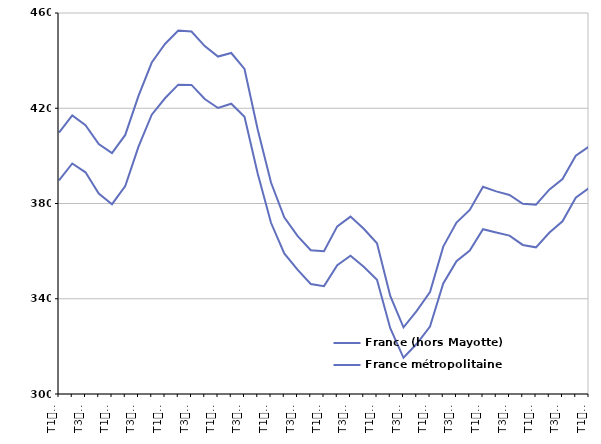
| Category | France (hors Mayotte) | France métropolitaine |
|---|---|---|
| T1
2014 | 409.8 | 389.7 |
| T2
2014 | 417 | 396.8 |
| T3
2014 | 412.9 | 393.1 |
| T4
2014 | 405 | 384.2 |
| T1
2015 | 401.2 | 379.7 |
| T2
2015 | 408.8 | 387.3 |
| T3
2015 | 425.2 | 403.9 |
| T4
2015 | 439.2 | 417.3 |
| T1
2016 | 447 | 424.2 |
| T2
2016 | 452.6 | 429.9 |
| T3
2016 | 452.2 | 429.8 |
| T4
2016 | 446.1 | 423.9 |
| T1
2017 | 441.7 | 420.1 |
| T2
2017 | 443.2 | 421.9 |
| T3
2017 | 436.5 | 416.4 |
| T4
2017 | 411 | 392.5 |
| T1
2018 | 388.8 | 371.9 |
| T2
2018 | 374.2 | 359 |
| T3
2018 | 366.4 | 352.2 |
| T4
2018 | 360.4 | 346.2 |
| T1
2019 | 360 | 345.3 |
| T2
2019 | 370.4 | 354.1 |
| T3
2019 | 374.5 | 358.1 |
| T4
2019 | 369.4 | 353.4 |
| T1
2020 | 363.3 | 348 |
| T2
2020 | 341.2 | 327.6 |
| T3
2020 | 328 | 315.2 |
| T4
2020 | 334.9 | 321.1 |
| T1
2021 | 342.8 | 328.3 |
| T2
2021 | 361.9 | 346.4 |
| T3
2021 | 372 | 355.8 |
| T4
2021 | 377.3 | 360.2 |
| T1
2022 | 387 | 369.2 |
| T2
2022 | 385.1 | 367.8 |
| T3
2022 | 383.6 | 366.5 |
| T4
2022 | 379.9 | 362.6 |
| T1
2023 | 379.5 | 361.6 |
| T2
2023 | 385.8 | 367.7 |
| T3
2023 | 390.3 | 372.5 |
| T4
2023 | 400.1 | 382.4 |
| T1
2024 | 403.9 | 386.5 |